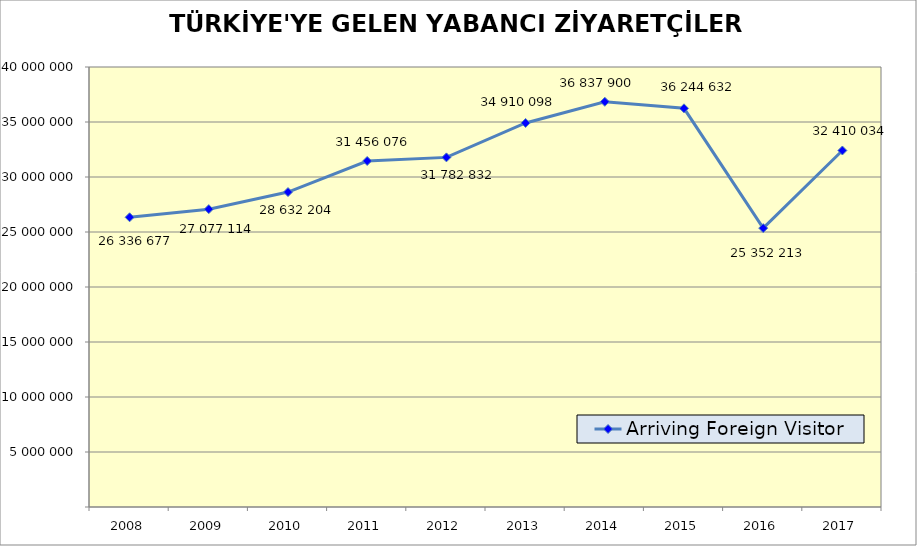
| Category | Arriving Foreign Visitor |
|---|---|
| 2008 | 26336677 |
| 2009 | 27077114 |
| 2010 | 28632204 |
| 2011 | 31456076 |
| 2012 | 31782832 |
| 2013 | 34910098 |
| 2014 | 36837900 |
| 2015 | 36244632 |
| 2016 | 25352213 |
| 2017 | 32410034 |